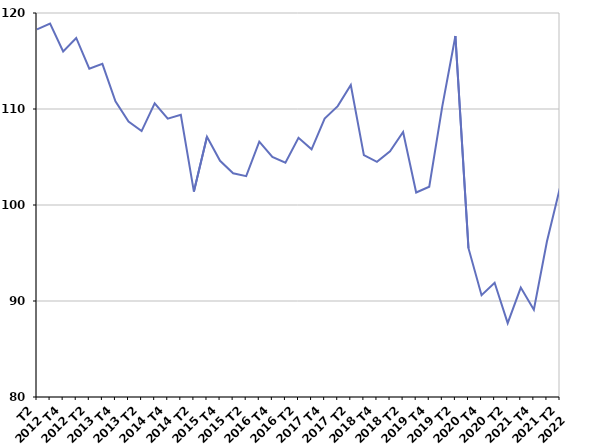
| Category | Fin de contrat |
|---|---|
| T2
2012 | 118.3 |
| T3
2012 | 118.9 |
| T4
2012 | 116 |
| T1
2013 | 117.4 |
| T2
2013 | 114.2 |
| T3
2013 | 114.7 |
| T4
2013 | 110.8 |
| T1
2014 | 108.7 |
| T2
2014 | 107.7 |
| T3
2014 | 110.6 |
| T4
2014 | 109 |
| T1
2015 | 109.4 |
| T2
2015 | 101.4 |
| T3
2015 | 107.1 |
| T4
2015 | 104.6 |
| T1
2016 | 103.3 |
| T2
2016 | 103 |
| T3
2016 | 106.6 |
| T4
2016 | 105 |
| T1
2017 | 104.4 |
| T2
2017 | 107 |
| T3
2017 | 105.8 |
| T4
2017 | 109 |
| T1
2018 | 110.3 |
| T2
2018 | 112.5 |
| T3
2018 | 105.2 |
| T4
2018 | 104.5 |
| T1
2019 | 105.6 |
| T2
2019 | 107.6 |
| T3
2019 | 101.3 |
| T4
2019 | 101.9 |
| T1
2020 | 110.3 |
| T2
2020 | 117.6 |
| T3
2020 | 95.5 |
| T4
2020 | 90.6 |
| T1
2021 | 91.9 |
| T2
2021 | 87.7 |
| T3
2021 | 91.4 |
| T4
2021 | 89.1 |
| T1
2022 | 96.2 |
| T2
2022 | 101.8 |